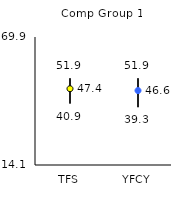
| Category | 25th | 75th | Mean |
|---|---|---|---|
| TFS | 40.9 | 51.9 | 47.35 |
| YFCY | 39.3 | 51.9 | 46.55 |